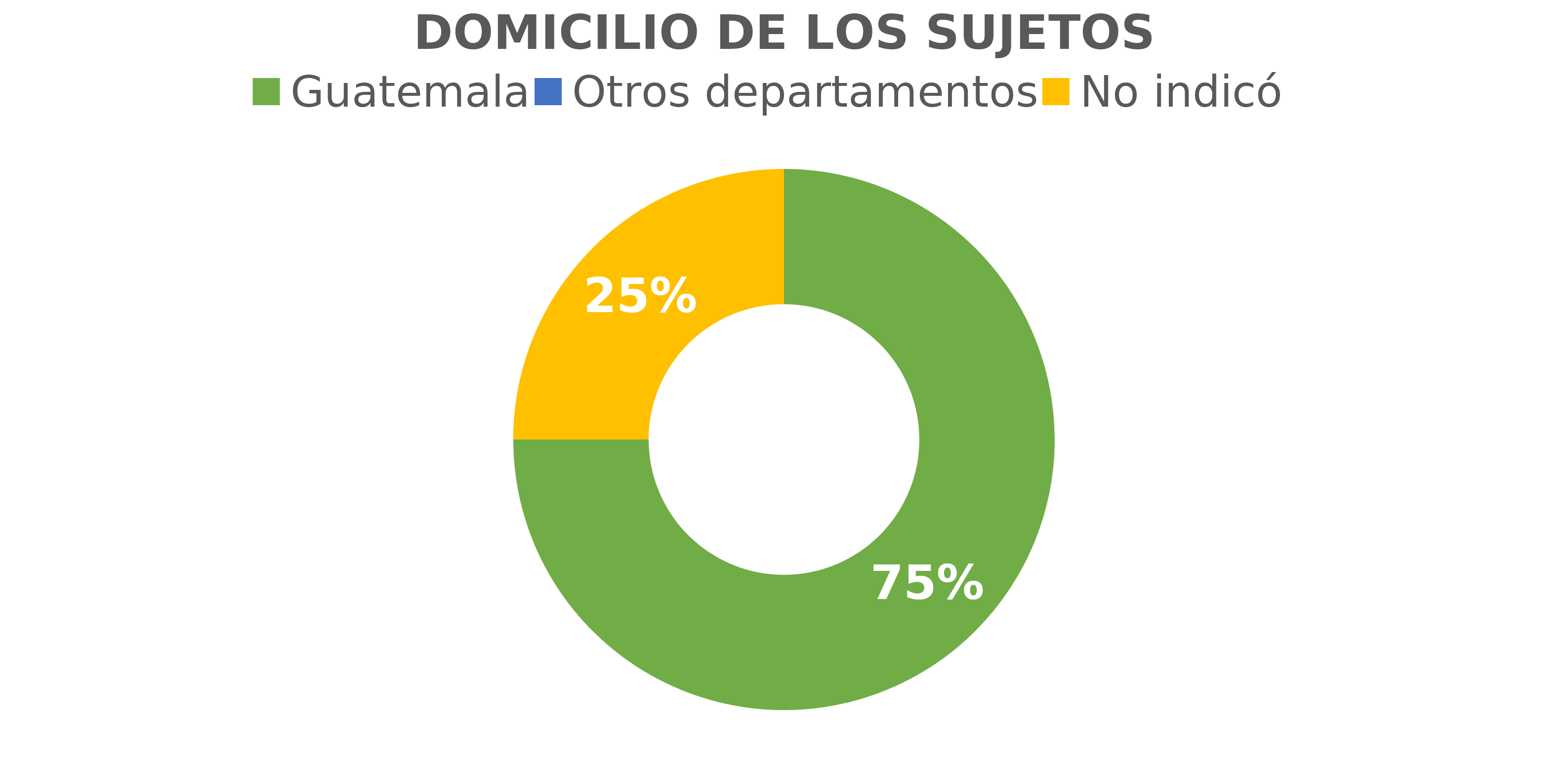
| Category | Series 0 |
|---|---|
| Guatemala | 3 |
| Otros departamentos | 0 |
| No indicó | 1 |